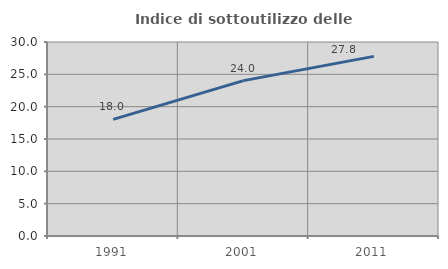
| Category | Indice di sottoutilizzo delle abitazioni  |
|---|---|
| 1991.0 | 18.038 |
| 2001.0 | 24.031 |
| 2011.0 | 27.774 |